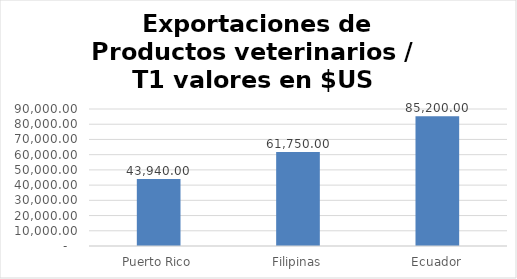
| Category | Valor US  |
|---|---|
| Puerto Rico | 43940 |
| Filipinas | 61750 |
| Ecuador | 85200 |